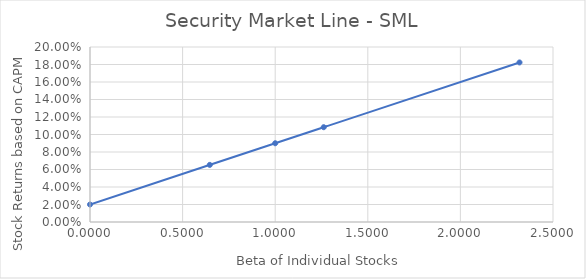
| Category | return-CAPM |
|---|---|
| 2.3191723816265246 | 0.182 |
| 0.6468577139965984 | 0.065 |
| 1.261981916641351 | 0.108 |
| 1.0 | 0.09 |
| 0.0 | 0.02 |